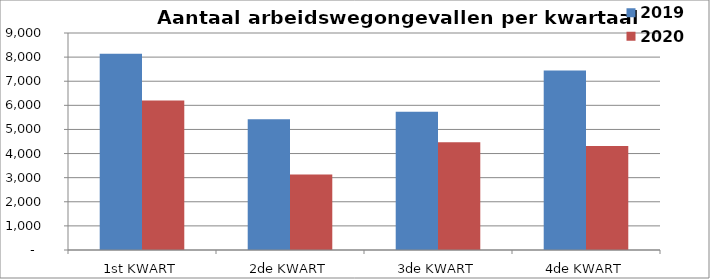
| Category | 2019 | 2020 |
|---|---|---|
| 1st KWART | 8141 | 6205 |
| 2de KWART | 5424 | 3136 |
| 3de KWART | 5729 | 4473 |
| 4de KWART | 7446 | 4312 |